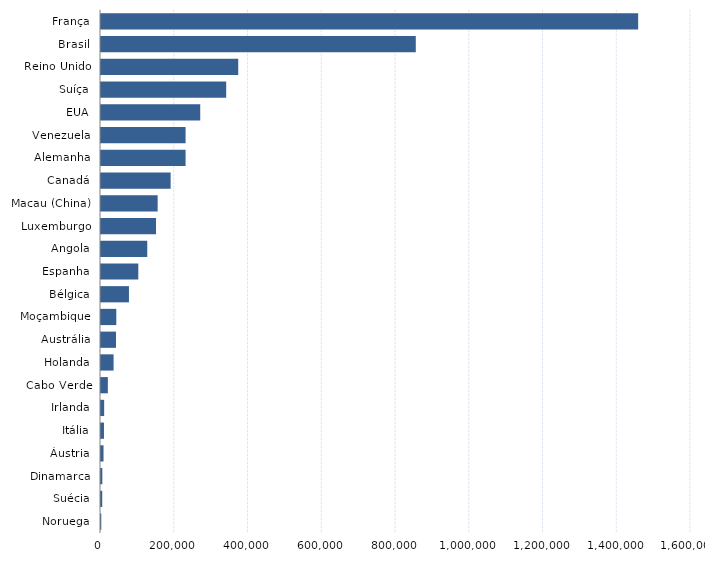
| Category | Series 0 |
|---|---|
| Noruega | 767 |
| Suécia | 3338 |
| Dinamarca | 3610 |
| Áustria | 6854 |
| Itália | 8051 |
| Irlanda | 8570 |
| Cabo Verde | 18561 |
| Holanda | 34118 |
| Austrália | 40641 |
| Moçambique | 41492 |
| Bélgica | 75788 |
| Espanha | 101185 |
| Angola | 125457 |
| Luxemburgo | 149215 |
| Macau (China) | 153615 |
| Canadá | 188826 |
| Alemanha | 229391 |
| Venezuela | 229405 |
| EUA | 269118 |
| Suíça | 339534 |
| Reino Unido | 372166 |
| Brasil | 853663 |
| França | 1456721 |